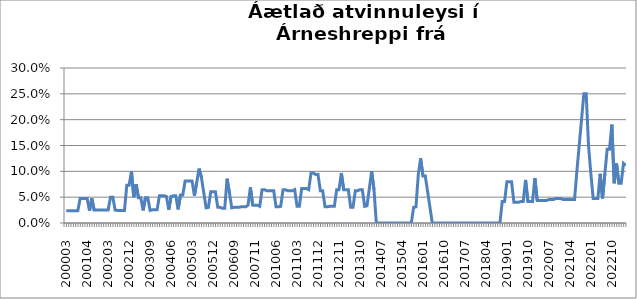
| Category | Series 0 |
|---|---|
| 200003 | 0.024 |
| 200004 | 0.024 |
| 200005 | 0.024 |
| 200010 | 0.024 |
| 200011 | 0.024 |
| 200012 | 0.024 |
| 200101 | 0.048 |
| 200102 | 0.048 |
| 200103 | 0.048 |
| 200104 | 0.048 |
| 200105 | 0.024 |
| 200106 | 0.048 |
| 200107 | 0.025 |
| 200108 | 0.025 |
| 200111 | 0.025 |
| 200112 | 0.025 |
| 200201 | 0.025 |
| 200202 | 0.025 |
| 200203 | 0.025 |
| 200204 | 0.05 |
| 200205 | 0.05 |
| 200206 | 0.025 |
| 200207 | 0.024 |
| 200208 | 0.024 |
| 200209 | 0.024 |
| 200210 | 0.024 |
| 200211 | 0.073 |
| 200212 | 0.073 |
| 200301 | 0.1 |
| 200302 | 0.05 |
| 200303 | 0.075 |
| 200304 | 0.049 |
| 200305 | 0.049 |
| 200306 | 0.024 |
| 200307 | 0.049 |
| 200308 | 0.049 |
| 200309 | 0.024 |
| 200310 | 0.026 |
| 200311 | 0.026 |
| 200312 | 0.026 |
| 200401 | 0.053 |
| 200402 | 0.053 |
| 200403 | 0.053 |
| 200404 | 0.051 |
| 200405 | 0.026 |
| 200406 | 0.051 |
| 200407 | 0.053 |
| 200408 | 0.053 |
| 200409 | 0.026 |
| 200410 | 0.054 |
| 200411 | 0.054 |
| 200412 | 0.081 |
| 200501 | 0.081 |
| 200502 | 0.081 |
| 200503 | 0.081 |
| 200504 | 0.053 |
| 200505 | 0.079 |
| 200506 | 0.105 |
| 200507 | 0.088 |
| 200508 | 0.059 |
| 200509 | 0.029 |
| 200510 | 0.03 |
| 200511 | 0.061 |
| 200512 | 0.061 |
| 200601 | 0.061 |
| 200602 | 0.03 |
| 200603 | 0.03 |
| 200604 | 0.029 |
| 200605 | 0.029 |
| 200606 | 0.086 |
| 200607 | 0.059 |
| 200608 | 0.029 |
| 200609 | 0.03 |
| 200610 | 0.03 |
| 200702 | 0.03 |
| 200703 | 0.031 |
| 200704 | 0.031 |
| 200707 | 0.031 |
| 200708 | 0.034 |
| 200709 | 0.069 |
| 200710 | 0.034 |
| 200711 | 0.034 |
| 200906 | 0.034 |
| 200911 | 0.032 |
| 200912 | 0.065 |
| 201001 | 0.065 |
| 201002 | 0.062 |
| 201003 | 0.062 |
| 201004 | 0.062 |
| 201005 | 0.062 |
| 201006 | 0.031 |
| 201007 | 0.031 |
| 201008 | 0.032 |
| 201009 | 0.065 |
| 201010 | 0.065 |
| 201011 | 0.062 |
| 201012 | 0.062 |
| 201101 | 0.062 |
| 201102 | 0.065 |
| 201103 | 0.032 |
| 201104 | 0.032 |
| 201105 | 0.067 |
| 201106 | 0.067 |
| 201107 | 0.067 |
| 201108 | 0.065 |
| 201109 | 0.097 |
| 201110 | 0.097 |
| 201111 | 0.094 |
| 201112 | 0.094 |
| 201201 | 0.062 |
| 201202 | 0.062 |
| 201203 | 0.031 |
| 201204 | 0.031 |
| 201205 | 0.032 |
| 201208 | 0.032 |
| 201209 | 0.032 |
| 201210 | 0.065 |
| 201211 | 0.065 |
| 201212 | 0.097 |
| 201301 | 0.065 |
| 201302 | 0.065 |
| 201303 | 0.065 |
| 201304 | 0.03 |
| 201305 | 0.03 |
| 201308 | 0.062 |
| 201309 | 0.062 |
| 201310 | 0.065 |
| 201311 | 0.065 |
| 201312 | 0.032 |
| 201401 | 0.033 |
| 201402 | 0.067 |
| 201403 | 0.1 |
| 201404 | 0.065 |
| 201405 | 0 |
| 201406 | 0 |
| 201407 | 0 |
| 201408 | 0 |
| 201409 | 0 |
| 201410 | 0 |
| 201411 | 0 |
| 201412 | 0 |
| 201501 | 0 |
| 201502 | 0 |
| 201503 | 0 |
| 201504 | 0 |
| 201505 | 0 |
| 201506 | 0 |
| 201507 | 0 |
| 201508 | 0 |
| 201509 | 0.03 |
| 201510 | 0.031 |
| 201511 | 0.094 |
| 201512 | 0.125 |
| 201601 | 0.091 |
| 201602 | 0.091 |
| 201603 | 0.061 |
| 201604 | 0.03 |
| 201605 | 0 |
| 201606 | 0 |
| 201607 | 0 |
| 201608 | 0 |
| 201609 | 0 |
| 201610 | 0 |
| 201611 | 0 |
| 201612 | 0 |
| 201701 | 0 |
| 201702 | 0 |
| 201703 | 0 |
| 201704 | 0 |
| 201705 | 0 |
| 201706 | 0 |
| 201707 | 0 |
| 201708 | 0 |
| 201709 | 0 |
| 201710 | 0 |
| 201711 | 0 |
| 201712 | 0 |
| 201801 | 0 |
| 201802 | 0 |
| 201803 | 0 |
| 201804 | 0 |
| 201805 | 0 |
| 201806 | 0 |
| 201807 | 0 |
| 201808 | 0 |
| 201809 | 0 |
| 201810 | 0 |
| 201811 | 0.042 |
| 201812 | 0.042 |
| 201901 | 0.08 |
| 201902 | 0.08 |
| 201903 | 0.08 |
| 201904 | 0.04 |
| 201905 | 0.04 |
| 201906 | 0.04 |
| 201907 | 0.042 |
| 201908 | 0.042 |
| 201909 | 0.083 |
| 201910 | 0.042 |
| 201911 | 0.042 |
| 201912 | 0.042 |
| 202001 | 0.087 |
| 202002 | 0.043 |
| 202003 | 0.043 |
| 202004 | 0.043 |
| 202005 | 0.043 |
| 202006 | 0.043 |
| 202007 | 0.045 |
| 202008 | 0.045 |
| 202009 | 0.045 |
| 202010 | 0.048 |
| 202011 | 0.048 |
| 202012 | 0.048 |
| 202101 | 0.045 |
| 202102 | 0.045 |
| 202103 | 0.045 |
| 202104 | 0.045 |
| 202105 | 0.045 |
| 202106 | 0.045 |
| 202107 | 0.1 |
| 202108 | 0.15 |
| 202109 | 0.2 |
| 202110 | 0.25 |
| 202111 | 0.25 |
| 202112 | 0.15 |
| 202201 | 0.095 |
| 202202 | 0.048 |
| 202203 | 0.048 |
| 202204 | 0.048 |
| 202205 | 0.095 |
| 202206 | 0.048 |
| 202207 | 0.095 |
| 202208 | 0.143 |
| 202209 | 0.143 |
| 202210 | 0.19 |
| 202211 | 0.077 |
| 202212 | 0.115 |
| 202301 | 0.077 |
| 202302 | 0.077 |
| 202303 | 0.115 |
| 202304 | 0.111 |